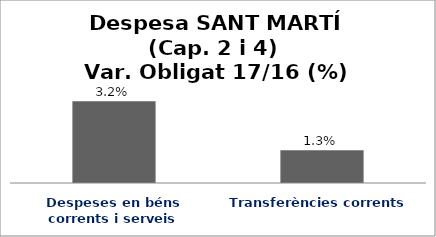
| Category | Series 0 |
|---|---|
| Despeses en béns corrents i serveis | 0.032 |
| Transferències corrents | 0.013 |